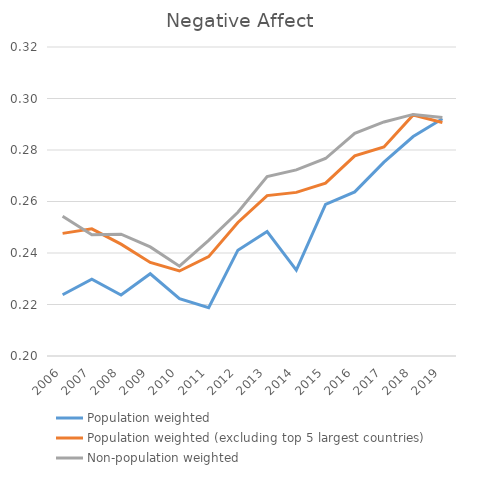
| Category | Population weighted | Population weighted (excluding top 5 largest countries) | Non-population weighted |
|---|---|---|---|
| 2006.0 | 0.224 | 0.248 | 0.254 |
| 2007.0 | 0.23 | 0.249 | 0.247 |
| 2008.0 | 0.224 | 0.243 | 0.247 |
| 2009.0 | 0.232 | 0.236 | 0.242 |
| 2010.0 | 0.222 | 0.233 | 0.235 |
| 2011.0 | 0.219 | 0.239 | 0.245 |
| 2012.0 | 0.241 | 0.252 | 0.256 |
| 2013.0 | 0.248 | 0.262 | 0.27 |
| 2014.0 | 0.233 | 0.264 | 0.272 |
| 2015.0 | 0.259 | 0.267 | 0.277 |
| 2016.0 | 0.264 | 0.278 | 0.286 |
| 2017.0 | 0.275 | 0.281 | 0.291 |
| 2018.0 | 0.285 | 0.294 | 0.294 |
| 2019.0 | 0.292 | 0.291 | 0.293 |